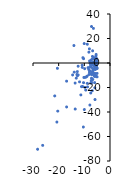
| Category | Series 0 |
|---|---|
| -10.0 | -38 |
| -10.83786 | -1.829 |
| -5.400035 | -10.8 |
| -5.838281 | -29.822 |
| -5.050494 | 1.048 |
| -10.66595 | -19.194 |
| -5.743759 | -8.892 |
| -6.95127 | 0.194 |
| -14.56647 | -9.763 |
| -8.834827 | 15.322 |
| -5.910008 | -20.217 |
| -7.550775 | -1.475 |
| -7.539253 | -3.169 |
| -7.652528 | 0.911 |
| -5.646222 | 0.392 |
| -5.011936 | -4.357 |
| -21.53334 | -26.87 |
| -10.78932 | -3.61 |
| -6.82548 | 5.338 |
| -6.23634 | -10.066 |
| -16.90778 | -14.827 |
| -8.215659 | 8.856 |
| -7.785601 | -0.091 |
| -6.833755 | -4.202 |
| -12.91017 | -9.392 |
| -13.58796 | -16.39 |
| -5.398378 | 3.133 |
| -5.276682 | -1.667 |
| -7.498549 | -24.498 |
| -7.383633 | -9.085 |
| -16.91057 | -35.893 |
| -12.71662 | -7.017 |
| -6.655203 | -7.597 |
| -5.454318 | -4.509 |
| -8.193668 | -9.411 |
| -7.217896 | -16.125 |
| -8.269036 | -5.277 |
| -20.69999 | -48.2 |
| -8.943175 | -10.826 |
| -5.565278 | -1.62 |
| -11.85992 | -15.399 |
| -5.037541 | -8.495 |
| -7.201297 | 29.794 |
| -20.48648 | -4.339 |
| -5.497792 | 0.026 |
| -5.882643 | -3.376 |
| -6.551031 | -5.762 |
| -13.14031 | -12.371 |
| -9.345724 | -11.528 |
| -6.6087 | -8.52 |
| -5.159778 | -3.81 |
| -7.964602 | 1.651 |
| -5.471192 | 5.837 |
| -20.36067 | -39.282 |
| -10.04961 | 15.846 |
| -26.22889 | -67.237 |
| -7.076103 | -9.447 |
| -6.773254 | 9.956 |
| -28.20889 | -70.404 |
| -6.460419 | -2.083 |
| -5.275305 | 3.832 |
| -11.35251 | -26.055 |
| -12.39689 | -9.764 |
| -13.55204 | -37.584 |
| -9.8 | -11.7 |
| -6.306352 | -5.125 |
| -12.40797 | -2.623 |
| -5.244964 | -2.729 |
| -7.332981 | 2.359 |
| -10.31315 | 3.516 |
| -7.444169 | -1.278 |
| -7.988981 | -7.39 |
| -8.022408 | 11.554 |
| -5.15873 | 3.209 |
| -5.758682 | 0.116 |
| -5.405448 | 6.967 |
| -6.9 | -22.6 |
| -6.946418 | 3.174 |
| -10.16889 | -11.79 |
| -7.844874 | -34.322 |
| -6.516446 | -5.067 |
| -6.611233 | -1.522 |
| -6.709439 | -13.434 |
| -8.754176 | -19.506 |
| -14.06086 | 14.266 |
| -6.343363 | -1.662 |
| -9.452736 | -22.09 |
| -7.323684 | -14.63 |
| -6.000013 | -16 |
| -7.170856 | -14.176 |
| -6.053089 | -10.871 |
| -7.066833 | -7.865 |
| -5.344864 | 1.006 |
| -7.8 | -3.3 |
| -5.705853 | -5.287 |
| -10.37808 | -52.268 |
| -5.832119 | -8.762 |
| -11.09816 | -19.315 |
| -5.625191 | -2.323 |
| -6.244799 | 3.393 |
| -5.326393 | -1.581 |
| -5.887128 | -8.738 |
| -6.740417 | -6.608 |
| -6.462625 | 28.259 |
| -5.290131 | -0.463 |
| -7.498806 | -16.399 |
| -7.797361 | -6.56 |
| -10.55556 | 4.351 |
| -5.117271 | -4.443 |
| -5.865922 | -10.91 |
| -5.033113 | -11.309 |
| -5.46697 | 2.123 |
| -6.711838 | -7.551 |
| -6.498145 | 0.798 |
| -6.06702 | 4.291 |
| -8.556003 | -3.758 |
| -10.31237 | -16.064 |
| -5.455995 | 1.734 |
| -5.697475 | 0.466 |
| -7.188498 | -12.438 |
| -5.242922 | -3.607 |
| -9.771987 | -19.88 |
| -9.85553 | -4.633 |
| -13.91971 | -7.452 |
| -5.970458 | -2.284 |
| -8.855647 | -16.611 |
| -12.7149 | -10.322 |